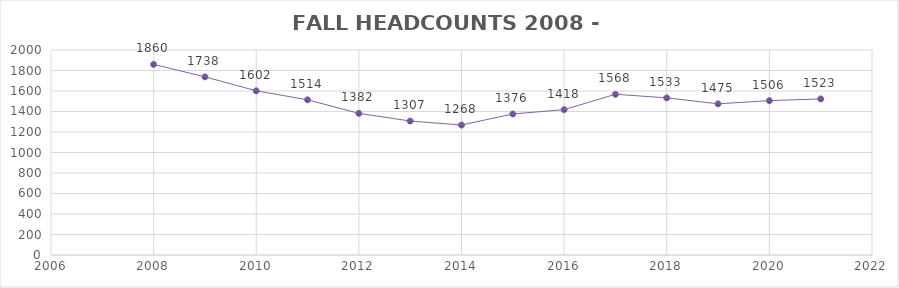
| Category | Series 0 |
|---|---|
| 2008.0 | 1860 |
| 2009.0 | 1738 |
| 2010.0 | 1602 |
| 2011.0 | 1514 |
| 2012.0 | 1382 |
| 2013.0 | 1307 |
| 2014.0 | 1268 |
| 2015.0 | 1376 |
| 2016.0 | 1418 |
| 2017.0 | 1568 |
| 2018.0 | 1533 |
| 2019.0 | 1475 |
| 2020.0 | 1506 |
| 2021.0 | 1523 |